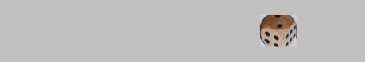
| Category | 1 | 2 | 3 | 4 | 5 | 6 |
|---|---|---|---|---|---|---|
|  | 0 | 0 | 0 | 0 | 0 | 0 |
|  | 0 | 0 | 0 | 0 | 0 | 0 |
|  | 0 | 0 | 0 | 0 | 0 | 0 |
|  | 0 | 0 | 0 | 0 | 0 | 0 |
|  | 0 | 0 | 0 | 0 | 0 | 0 |
| 2 | 0 | 1 | 0 | 0 | 0 | 0 |